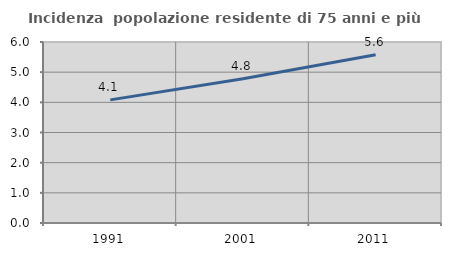
| Category | Incidenza  popolazione residente di 75 anni e più |
|---|---|
| 1991.0 | 4.081 |
| 2001.0 | 4.781 |
| 2011.0 | 5.575 |